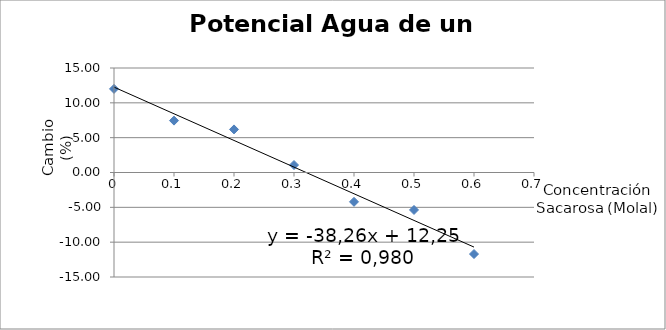
| Category | Concentración (Molal) |
|---|---|
| 0.0 | 12 |
| 0.1 | 7.447 |
| 0.2 | 6.186 |
| 0.3 | 1.075 |
| 0.4 | -4.211 |
| 0.5 | -5.376 |
| 0.6 | -11.702 |